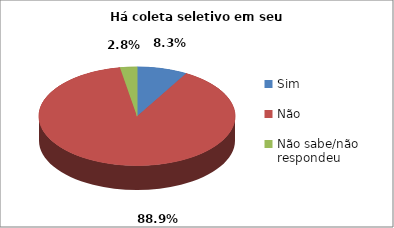
| Category | Series 0 |
|---|---|
| Sim | 3 |
| Não | 32 |
| Não sabe/não respondeu | 1 |